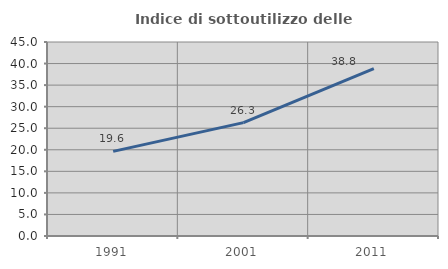
| Category | Indice di sottoutilizzo delle abitazioni  |
|---|---|
| 1991.0 | 19.625 |
| 2001.0 | 26.299 |
| 2011.0 | 38.844 |